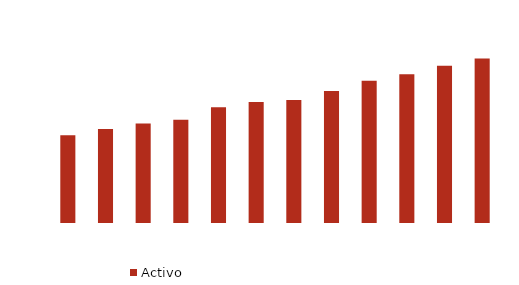
| Category | Activo |
|---|---|
| 2002.0 | 13.793 |
| 2003.0 | 14.761 |
| 2004.0 | 15.621 |
| 2005.0 | 16.234 |
| 2006.0 | 18.169 |
| 2007.0 | 18.998 |
| 2008.0 | 19.317 |
| 2009.0 | 20.74 |
| 2010.0 | 22.361 |
| 2011.0 | 23.37 |
| 2012.0 | 24.693 |
| 2013.0 | 25.839 |